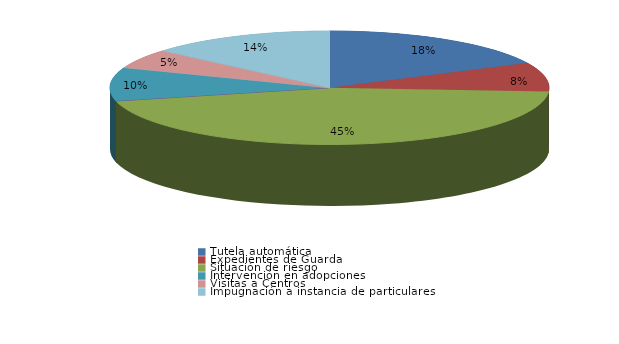
| Category | Series 0 |
|---|---|
| Tutela automática | 13 |
| Expedientes de Guarda | 6 |
| Situación de riesgo | 33 |
| Intervención en acogimientos | 0 |
| Intervención en adopciones | 7 |
| Defensa de los derechos fundamentales | 0 |
| Sustracción internacional de menores | 0 |
| Visitas a Centros | 4 |
| Ensayos Clínicos | 0 |
| Impugnación a instacia del Fiscal | 0 |
| Impugnación a instancia de particulares | 10 |